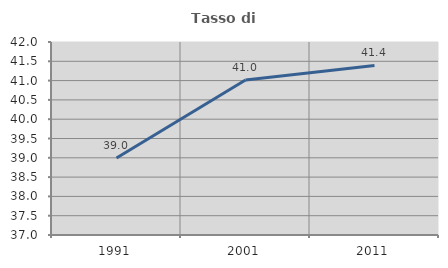
| Category | Tasso di occupazione   |
|---|---|
| 1991.0 | 38.994 |
| 2001.0 | 41.014 |
| 2011.0 | 41.393 |